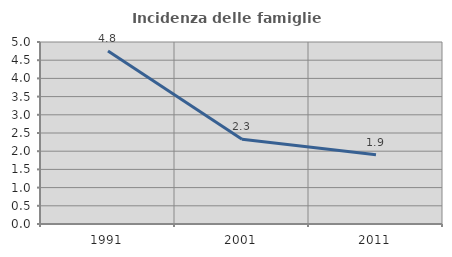
| Category | Incidenza delle famiglie numerose |
|---|---|
| 1991.0 | 4.753 |
| 2001.0 | 2.33 |
| 2011.0 | 1.899 |